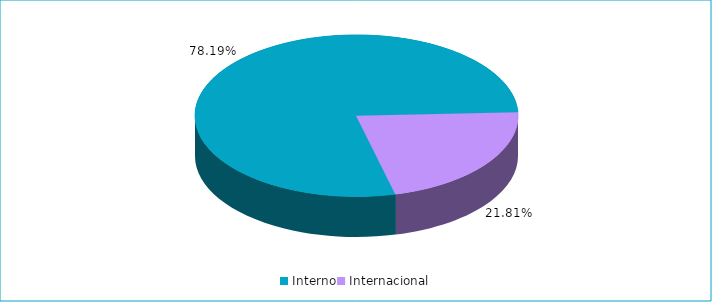
| Category | Series 0 |
|---|---|
| Interno | 0.782 |
| Internacional | 0.218 |